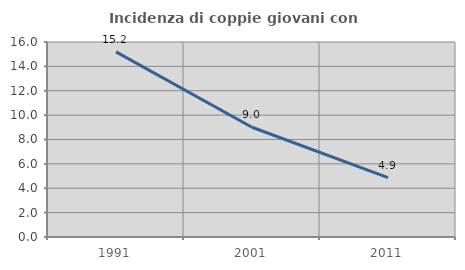
| Category | Incidenza di coppie giovani con figli |
|---|---|
| 1991.0 | 15.192 |
| 2001.0 | 9.004 |
| 2011.0 | 4.869 |